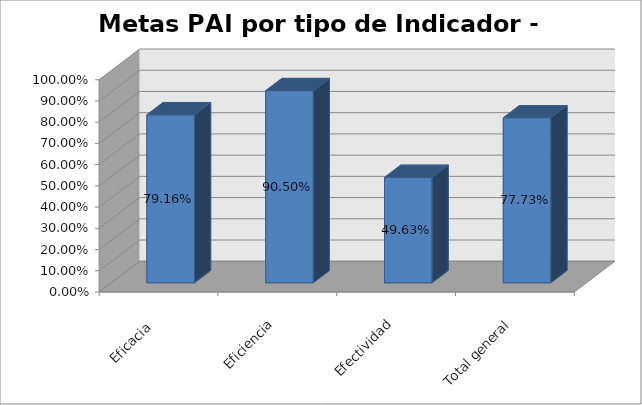
| Category | PROMEDIO  |
|---|---|
| Eficacia  | 0.792 |
| Eficiencia | 0.905 |
| Efectividad | 0.496 |
| Total general | 0.777 |